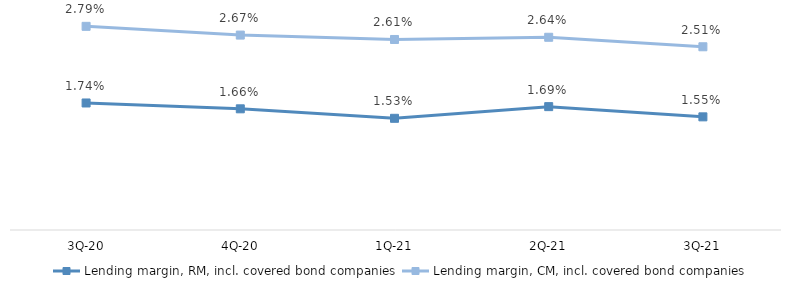
| Category | Lending margin, RM, incl. covered bond companies | Lending margin, CM, incl. covered bond companies |
|---|---|---|
| 3Q-21 | 0.016 | 0.025 |
| 2Q-21 | 0.017 | 0.026 |
| 1Q-21 | 0.015 | 0.026 |
| 4Q-20 | 0.017 | 0.027 |
| 3Q-20 | 0.017 | 0.028 |